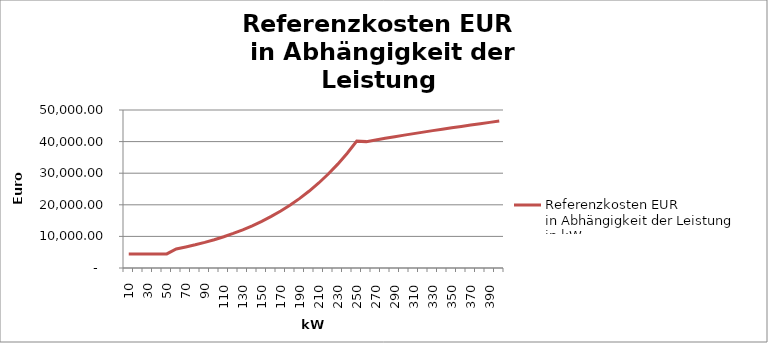
| Category | Referenzkosten EUR 
in Abhängigkeit der Leistung 
in kW |
|---|---|
| 10.0 | 4449.76 |
| 20.0 | 4449.76 |
| 30.0 | 4449.76 |
| 40.0 | 4449.76 |
| 50.0 | 4449.76 |
| 60.0 | 6004.056 |
| 70.0 | 6635.508 |
| 80.0 | 7333.371 |
| 90.0 | 8104.628 |
| 100.0 | 8957 |
| 110.0 | 9899.015 |
| 120.0 | 10940.104 |
| 130.0 | 12090.685 |
| 140.0 | 13362.273 |
| 150.0 | 14767.596 |
| 160.0 | 16320.717 |
| 170.0 | 18037.182 |
| 180.0 | 19934.169 |
| 190.0 | 22030.664 |
| 200.0 | 24347.649 |
| 210.0 | 26908.314 |
| 220.0 | 29738.286 |
| 230.0 | 32865.889 |
| 240.0 | 36322.424 |
| 250.0 | 40142.487 |
| 260.0 | 39993.269 |
| 270.0 | 40524.321 |
| 280.0 | 41042.729 |
| 290.0 | 41549.229 |
| 300.0 | 42044.491 |
| 310.0 | 42529.128 |
| 320.0 | 43003.7 |
| 330.0 | 43468.72 |
| 340.0 | 43924.661 |
| 350.0 | 44371.962 |
| 360.0 | 44811.024 |
| 370.0 | 45242.223 |
| 380.0 | 45665.906 |
| 390.0 | 46082.397 |
| 400.0 | 46491.999 |